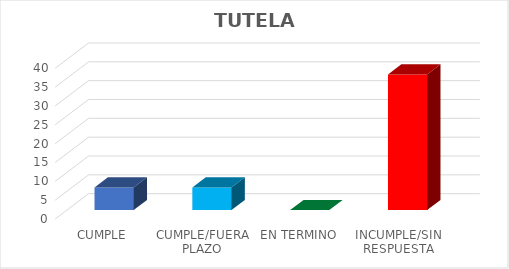
| Category | Series 0 |
|---|---|
| CUMPLE | 6 |
| CUMPLE/FUERA PLAZO | 6 |
| EN TERMINO | 0 |
| INCUMPLE/SIN RESPUESTA | 36 |